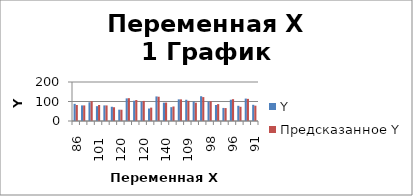
| Category | Y | Предсказанное Y |
|---|---|---|
| 86.0 | 88 | 82.188 |
| 62.0 | 80 | 79.914 |
| 110.0 | 96 | 101.375 |
| 101.0 | 76 | 81.978 |
| 100.0 | 80 | 79.883 |
| 78.0 | 73 | 70.525 |
| 120.0 | 58 | 57.771 |
| 105.0 | 116 | 117.079 |
| 112.0 | 104 | 107.504 |
| 120.0 | 99 | 102.956 |
| 87.0 | 64 | 68.543 |
| 133.0 | 126 | 124.464 |
| 140.0 | 94 | 94.504 |
| 84.0 | 71 | 74.451 |
| 106.0 | 111 | 110.906 |
| 109.0 | 109 | 103.435 |
| 104.0 | 100 | 94.004 |
| 150.0 | 127 | 122.598 |
| 98.0 | 99 | 101.067 |
| 120.0 | 82 | 86.499 |
| 74.0 | 67 | 66.376 |
| 96.0 | 109 | 111.939 |
| 104.0 | 78 | 72.943 |
| 94.0 | 115 | 113.512 |
| 91.0 | 83 | 78.586 |